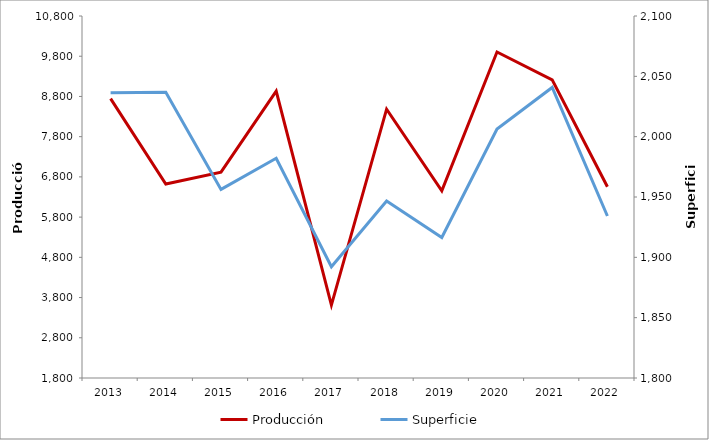
| Category | Producción |
|---|---|
| 2013.0 | 8744.637 |
| 2014.0 | 6621.355 |
| 2015.0 | 6917.037 |
| 2016.0 | 8932.597 |
| 2017.0 | 3612.395 |
| 2018.0 | 8484.066 |
| 2019.0 | 6453.31 |
| 2020.0 | 9904.252 |
| 2021.0 | 9211.56 |
| 2022.0 | 6553.87 |